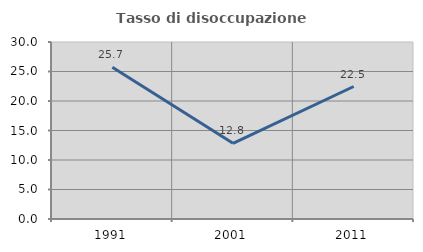
| Category | Tasso di disoccupazione giovanile  |
|---|---|
| 1991.0 | 25.732 |
| 2001.0 | 12.831 |
| 2011.0 | 22.458 |